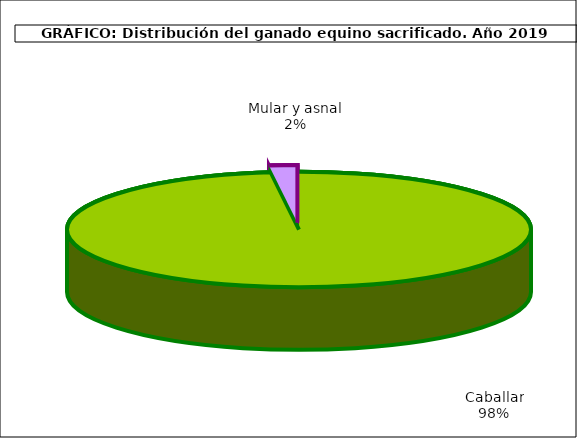
| Category | Series 0 |
|---|---|
| Caballar | 36484.1 |
| Mular y asnal | 727 |